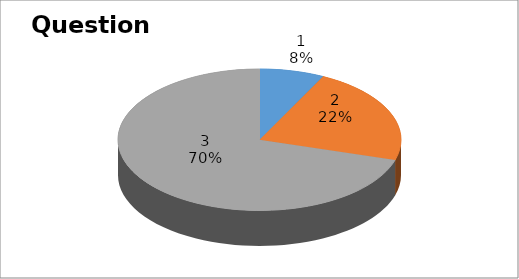
| Category | Series 0 |
|---|---|
| 0 | 4 |
| 1 | 12 |
| 2 | 38 |